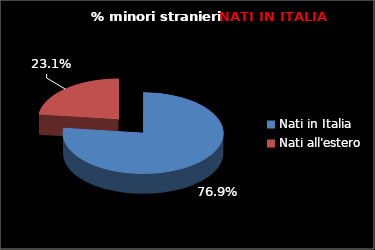
| Category | Series 0 |
|---|---|
| Nati in Italia | 10 |
| Nati all'estero | 3 |